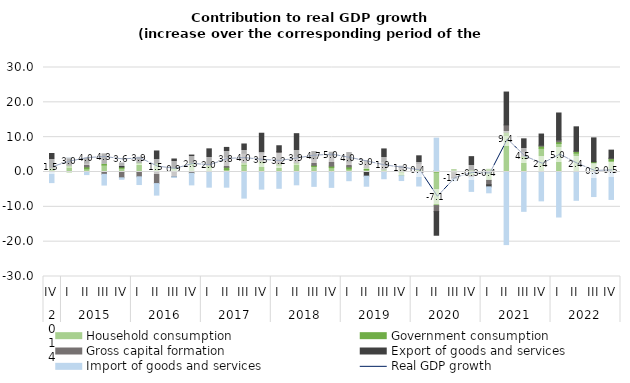
| Category | Household consumption | Government consumption | Gross capital formation | Export of goods and services | Import of goods and services |
|---|---|---|---|---|---|
| 0 | 0.487 | 0.636 | 0.237 | 3.946 | -3.044 |
| 1 | 1.376 | 0.594 | 0.023 | 2.08 | 0.011 |
| 2 | 0.929 | 0.546 | 1.115 | 1.377 | -0.742 |
| 3 | 2.003 | 0.498 | -0.669 | 2.701 | -3.08 |
| 4 | 1.069 | 0.364 | -1.672 | 1.17 | -0.422 |
| 5 | 2.433 | 0.323 | -1.384 | 1.456 | -2.215 |
| 6 | 2.201 | 0.311 | -3.327 | 3.525 | -3.309 |
| 7 | 0.938 | 0.375 | -1.386 | 2.422 | -0.192 |
| 8 | 2.218 | 0.535 | -0.371 | 2.111 | -3.324 |
| 9 | 1.283 | 0.593 | 0.29 | 4.48 | -4.351 |
| 10 | 0.677 | 0.678 | 2.958 | 2.747 | -4.357 |
| 11 | 2.054 | 0.653 | 2.687 | 2.649 | -7.494 |
| 12 | 2.595 | 0.538 | 2.383 | 5.614 | -4.909 |
| 13 | 1.889 | 0.428 | 3.536 | 1.682 | -4.675 |
| 14 | 2.346 | 0.333 | 1.917 | 6.406 | -3.676 |
| 15 | 1.575 | 0.334 | 1.947 | 2.036 | -4.123 |
| 16 | 1.255 | 0.428 | 3.021 | 0.966 | -4.416 |
| 17 | 0.876 | 0.582 | 1.476 | 2.65 | -2.496 |
| 18 | 0.634 | 0.659 | 2.017 | -1.189 | -2.891 |
| 19 | 0.193 | 0.631 | 2.218 | 3.581 | -1.931 |
| 20 | -1.091 | 0.587 | 0.739 | 0.327 | -1.358 |
| 21 | 0.316 | 0.471 | 1.714 | 2.146 | -4.021 |
| 22 | -9.642 | 0.418 | -1.727 | -6.786 | 9.3 |
| 23 | -0.212 | 0.567 | -1.53 | -0.243 | -0.552 |
| 24 | -1.01 | 0.626 | -0.458 | 3.783 | -4.1 |
| 25 | -2.35 | 0.773 | -1.329 | -0.583 | -1.711 |
| 26 | 10.479 | 0.917 | 2.125 | 9.435 | -20.839 |
| 27 | 3.855 | 0.732 | 1.343 | 3.59 | -11.294 |
| 28 | 6.803 | 0.604 | 0.292 | 3.202 | -8.28 |
| 29 | 8.18 | 0.49 | 0.532 | 7.737 | -12.925 |
| 30 | 5.416 | 0.457 | 0.129 | 6.966 | -8.126 |
| 31 | 2.411 | 0.514 | -0.018 | 6.868 | -7.027 |
| 32 | 3.206 | 0.62 | 0.162 | 2.291 | -7.876 |